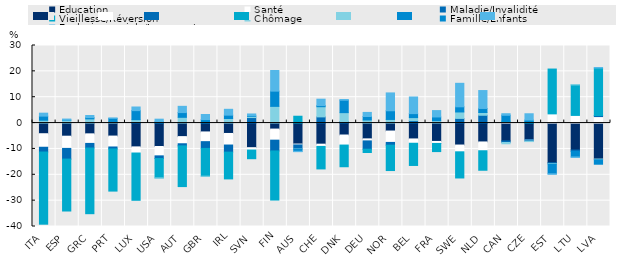
| Category | Éducation | Santé | Maladie/Invalidité | Vieillesse/Réversion | Chômage | Famille/Enfants | Exclusion sociale/Logement |
|---|---|---|---|---|---|---|---|
| ITA | -4.118 | -5.233 | -1.844 | -27.913 | 1.101 | 1.587 | 1.138 |
| ESP | -5.077 | -4.719 | -4.135 | -20.079 | 1.079 | 0.086 | 0.382 |
| GRC | -4.164 | -3.702 | -1.789 | -25.393 | 1.627 | 0.496 | 0.795 |
| PRT | -5.028 | -4.218 | -0.74 | -16.317 | 0.618 | 1.206 | 0.122 |
| LUX | -9.21 | -2.368 | 0.336 | -18.287 | 0.981 | 3.499 | 1.4 |
| USA | -9.052 | -3.628 | -1.033 | -7.495 | -0.093 | 0.51 | 0.996 |
| AUT | -5.235 | -2.761 | -0.821 | -15.746 | 2.224 | 1.84 | 2.407 |
| GBR | -3.428 | -3.76 | -2.612 | -10.751 | -0.008 | 1.348 | 1.975 |
| IRL | -4.018 | -4.472 | -2.746 | -10.359 | 1.759 | 1.301 | 2.265 |
| SVN | -9.521 | -0.904 | 2.133 | -3.355 | 0.431 | 0.235 | 0.721 |
| FIN | -2.321 | -4.286 | -4.173 | -18.989 | 6.461 | 5.888 | 7.974 |
| AUS | -8.12 | -0.325 | -1.531 | 2.645 | -0.117 | -0.824 | -0.14 |
| CHE | -8.158 | -0.867 | 2.391 | -8.704 | 3.935 | 0.435 | 2.473 |
| DNK | -4.616 | -3.887 | 0.578 | -8.388 | 3.455 | 4.801 | 0.284 |
| DEU | -6.106 | -0.783 | -3.213 | -1.284 | 1.193 | 1.338 | 1.589 |
| NOR | -3.077 | -4.404 | -1.064 | -9.815 | 1.394 | 3.366 | 6.899 |
| BEL | -6.136 | -1.668 | 0.939 | -8.59 | 1.173 | 1.545 | 6.432 |
| FRA | -7.097 | -0.787 | -0.02 | -3.124 | 0.923 | 1.44 | 2.463 |
| SWE | -8.494 | -2.62 | 1.803 | -10.121 | 2.494 | 1.993 | 9.083 |
| NLD | -7.299 | -3.405 | 3.02 | -7.543 | 1.061 | 1.57 | 6.925 |
| CAN | -6.902 | 0.475 | -0.615 | 0.223 | -0.496 | 2.312 | 0.611 |
| CZE | -6.413 | -0.03 | -0.511 | 0.639 | -0.198 | 0.533 | 2.428 |
| EST | -15.353 | 3.557 | -0.33 | 17.336 | -0.221 | -3.715 | -0.182 |
| LTU | -10.434 | 2.96 | -0.522 | 11.803 | 0.105 | -2.144 | -0.155 |
| LVA | -13.899 | 2.509 | 0.419 | 18.356 | -0.297 | -1.719 | 0.175 |